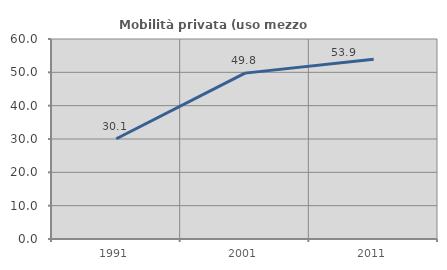
| Category | Mobilità privata (uso mezzo privato) |
|---|---|
| 1991.0 | 30.078 |
| 2001.0 | 49.763 |
| 2011.0 | 53.947 |